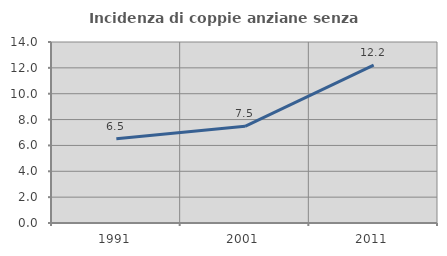
| Category | Incidenza di coppie anziane senza figli  |
|---|---|
| 1991.0 | 6.516 |
| 2001.0 | 7.478 |
| 2011.0 | 12.216 |